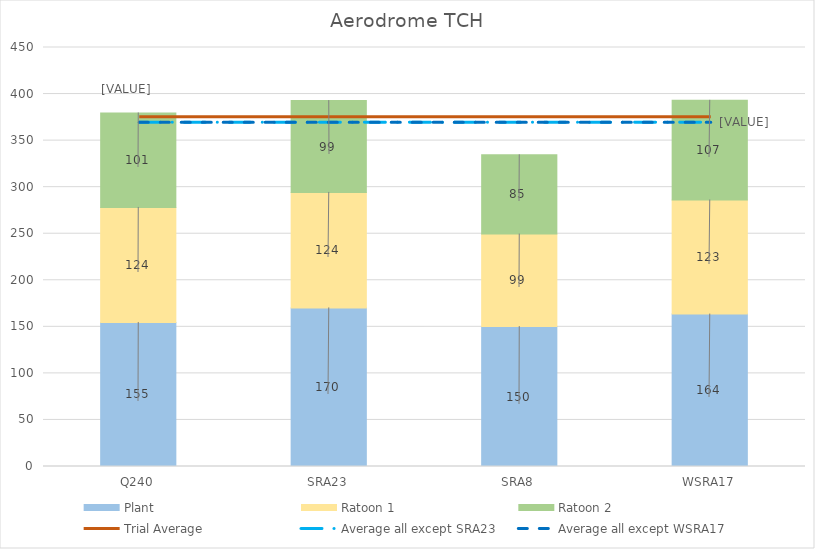
| Category | Plant | Ratoon 1 | Ratoon 2 |
|---|---|---|---|
| Q240 | 154.663 | 123.538 | 101.487 |
| SRA23 | 170.314 | 124.026 | 98.628 |
| SRA8 | 150.287 | 99.321 | 85.115 |
| WSRA17 | 163.711 | 122.538 | 107.013 |